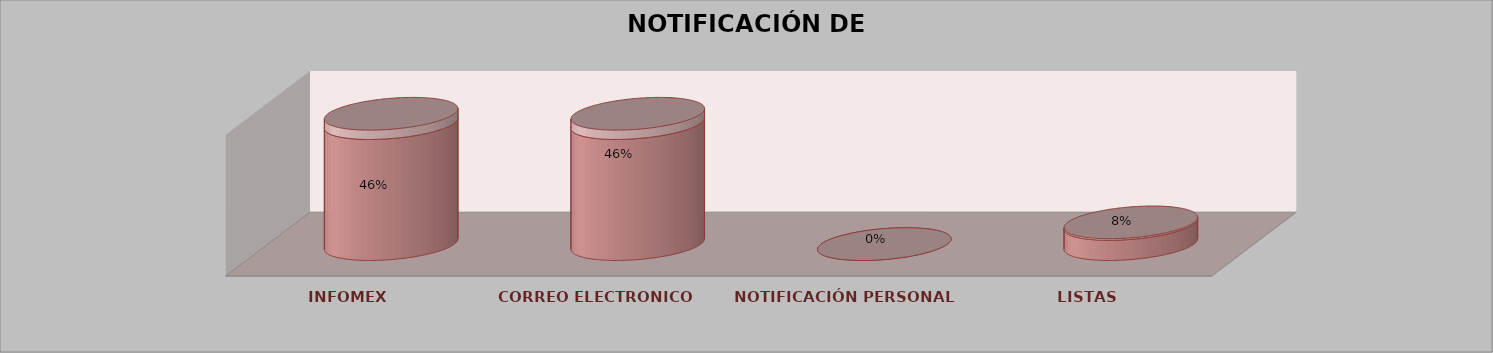
| Category | Series 0 | Series 1 | Series 2 | Series 3 | Series 4 |
|---|---|---|---|---|---|
| INFOMEX |  |  |  | 6 | 0.462 |
| CORREO ELECTRONICO |  |  |  | 6 | 0.462 |
| NOTIFICACIÓN PERSONAL |  |  |  | 0 | 0 |
| LISTAS |  |  |  | 1 | 0.077 |